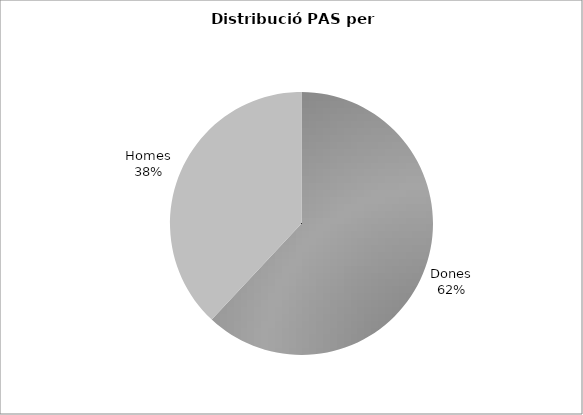
| Category | Series 0 |
|---|---|
| Dones | 917 |
| Homes | 563 |